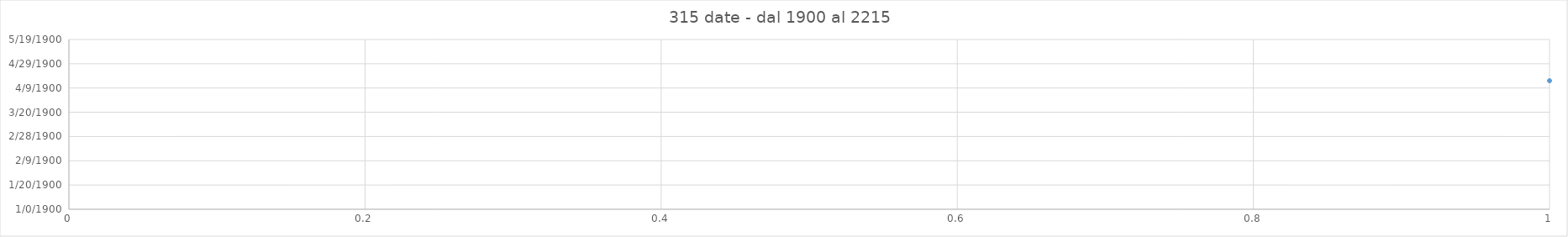
| Category | Series 0 |
|---|---|
| 0 | 4/15/00 |
| 1 | 4/7/00 |
| 2 | 3/30/00 |
| 3 | 4/12/00 |
| 4 | 4/3/00 |
| 5 | 4/23/00 |
| 6 | 4/15/00 |
| 7 | 3/31/00 |
| 8 | 4/19/00 |
| 9 | 4/11/00 |
| 10 | 3/27/00 |
| 11 | 4/16/00 |
| 12 | 4/7/00 |
| 13 | 3/23/00 |
| 14 | 4/12/00 |
| 15 | 4/4/00 |
| 16 | 4/23/00 |
| 17 | 4/8/00 |
| 18 | 3/31/00 |
| 19 | 4/20/00 |
| 20 | 4/4/00 |
| 21 | 3/27/00 |
| 22 | 4/16/00 |
| 23 | 4/1/00 |
| 24 | 4/20/00 |
| 25 | 4/12/00 |
| 26 | 4/4/00 |
| 27 | 4/17/00 |
| 28 | 4/8/00 |
| 29 | 3/31/00 |
| 30 | 4/20/00 |
| 31 | 4/5/00 |
| 32 | 3/27/00 |
| 33 | 4/16/00 |
| 34 | 4/1/00 |
| 35 | 4/21/00 |
| 36 | 4/12/00 |
| 37 | 3/28/00 |
| 38 | 4/17/00 |
| 39 | 4/9/00 |
| 40 | 3/24/00 |
| 41 | 4/13/00 |
| 42 | 4/5/00 |
| 43 | 4/25/00 |
| 44 | 4/9/00 |
| 45 | 4/1/00 |
| 46 | 4/21/00 |
| 47 | 4/6/00 |
| 48 | 3/28/00 |
| 49 | 4/17/00 |
| 50 | 4/9/00 |
| 51 | 3/25/00 |
| 52 | 4/13/00 |
| 53 | 4/5/00 |
| 54 | 4/18/00 |
| 55 | 4/10/00 |
| 56 | 4/1/00 |
| 57 | 4/21/00 |
| 58 | 4/6/00 |
| 59 | 3/29/00 |
| 60 | 4/17/00 |
| 61 | 4/2/00 |
| 62 | 4/22/00 |
| 63 | 4/14/00 |
| 64 | 3/29/00 |
| 65 | 4/18/00 |
| 66 | 4/10/00 |
| 67 | 3/26/00 |
| 68 | 4/14/00 |
| 69 | 4/6/00 |
| 70 | 3/29/00 |
| 71 | 4/11/00 |
| 72 | 4/2/00 |
| 73 | 4/22/00 |
| 74 | 4/14/00 |
| 75 | 3/30/00 |
| 76 | 4/18/00 |
| 77 | 4/10/00 |
| 78 | 3/26/00 |
| 79 | 4/15/00 |
| 80 | 4/6/00 |
| 81 | 4/19/00 |
| 82 | 4/11/00 |
| 83 | 4/3/00 |
| 84 | 4/22/00 |
| 85 | 4/7/00 |
| 86 | 3/30/00 |
| 87 | 4/19/00 |
| 88 | 4/3/00 |
| 89 | 3/26/00 |
| 90 | 4/15/00 |
| 91 | 3/31/00 |
| 92 | 4/19/00 |
| 93 | 4/11/00 |
| 94 | 4/3/00 |
| 95 | 4/16/00 |
| 96 | 4/7/00 |
| 97 | 3/30/00 |
| 98 | 4/12/00 |
| 99 | 4/4/00 |
| 100 | 4/23/00 |
| 101 | 4/15/00 |
| 102 | 3/31/00 |
| 103 | 4/20/00 |
| 104 | 4/11/00 |
| 105 | 3/27/00 |
| 106 | 4/16/00 |
| 107 | 4/8/00 |
| 108 | 3/23/00 |
| 109 | 4/12/00 |
| 110 | 4/4/00 |
| 111 | 4/24/00 |
| 112 | 4/8/00 |
| 113 | 3/31/00 |
| 114 | 4/20/00 |
| 115 | 4/5/00 |
| 116 | 3/27/00 |
| 117 | 4/16/00 |
| 118 | 4/1/00 |
| 119 | 4/21/00 |
| 120 | 4/12/00 |
| 121 | 4/4/00 |
| 122 | 4/17/00 |
| 123 | 4/9/00 |
| 124 | 3/31/00 |
| 125 | 4/20/00 |
| 126 | 4/5/00 |
| 127 | 3/28/00 |
| 128 | 4/16/00 |
| 129 | 4/1/00 |
| 130 | 4/21/00 |
| 131 | 4/13/00 |
| 132 | 3/28/00 |
| 133 | 4/17/00 |
| 134 | 4/9/00 |
| 135 | 3/25/00 |
| 136 | 4/13/00 |
| 137 | 4/5/00 |
| 138 | 4/25/00 |
| 139 | 4/10/00 |
| 140 | 4/1/00 |
| 141 | 4/21/00 |
| 142 | 4/6/00 |
| 143 | 3/29/00 |
| 144 | 4/17/00 |
| 145 | 4/9/00 |
| 146 | 3/25/00 |
| 147 | 4/14/00 |
| 148 | 4/5/00 |
| 149 | 4/18/00 |
| 150 | 4/10/00 |
| 151 | 4/2/00 |
| 152 | 4/21/00 |
| 153 | 4/6/00 |
| 154 | 3/29/00 |
| 155 | 4/18/00 |
| 156 | 4/2/00 |
| 157 | 4/22/00 |
| 158 | 4/14/00 |
| 159 | 3/30/00 |
| 160 | 4/18/00 |
| 161 | 4/10/00 |
| 162 | 3/26/00 |
| 163 | 4/15/00 |
| 164 | 4/6/00 |
| 165 | 3/29/00 |
| 166 | 4/11/00 |
| 167 | 4/3/00 |
| 168 | 4/22/00 |
| 169 | 4/14/00 |
| 170 | 3/30/00 |
| 171 | 4/19/00 |
| 172 | 4/10/00 |
| 173 | 3/26/00 |
| 174 | 4/15/00 |
| 175 | 4/7/00 |
| 176 | 4/19/00 |
| 177 | 4/11/00 |
| 178 | 4/3/00 |
| 179 | 4/23/00 |
| 180 | 4/7/00 |
| 181 | 3/30/00 |
| 182 | 4/19/00 |
| 183 | 4/4/00 |
| 184 | 3/26/00 |
| 185 | 4/15/00 |
| 186 | 3/31/00 |
| 187 | 4/20/00 |
| 188 | 4/11/00 |
| 189 | 4/3/00 |
| 190 | 4/16/00 |
| 191 | 4/8/00 |
| 192 | 3/30/00 |
| 193 | 4/12/00 |
| 194 | 4/4/00 |
| 195 | 4/24/00 |
| 196 | 4/15/00 |
| 197 | 3/31/00 |
| 198 | 4/20/00 |
| 199 | 4/12/00 |
| 200 | 3/28/00 |
| 201 | 4/17/00 |
| 202 | 4/9/00 |
| 203 | 3/25/00 |
| 204 | 4/13/00 |
| 205 | 4/5/00 |
| 206 | 4/18/00 |
| 207 | 4/10/00 |
| 208 | 4/1/00 |
| 209 | 4/21/00 |
| 210 | 4/6/00 |
| 211 | 3/29/00 |
| 212 | 4/17/00 |
| 213 | 4/2/00 |
| 214 | 4/22/00 |
| 215 | 4/14/00 |
| 216 | 3/29/00 |
| 217 | 4/18/00 |
| 218 | 4/10/00 |
| 219 | 3/26/00 |
| 220 | 4/14/00 |
| 221 | 4/6/00 |
| 222 | 3/29/00 |
| 223 | 4/11/00 |
| 224 | 4/2/00 |
| 225 | 4/22/00 |
| 226 | 4/14/00 |
| 227 | 3/30/00 |
| 228 | 4/18/00 |
| 229 | 4/10/00 |
| 230 | 3/26/00 |
| 231 | 4/15/00 |
| 232 | 4/6/00 |
| 233 | 4/19/00 |
| 234 | 4/11/00 |
| 235 | 4/3/00 |
| 236 | 4/22/00 |
| 237 | 4/7/00 |
| 238 | 3/30/00 |
| 239 | 4/19/00 |
| 240 | 4/3/00 |
| 241 | 3/26/00 |
| 242 | 4/15/00 |
| 243 | 3/31/00 |
| 244 | 4/19/00 |
| 245 | 4/11/00 |
| 246 | 4/3/00 |
| 247 | 4/16/00 |
| 248 | 4/7/00 |
| 249 | 3/30/00 |
| 250 | 4/12/00 |
| 251 | 4/4/00 |
| 252 | 4/23/00 |
| 253 | 4/15/00 |
| 254 | 3/31/00 |
| 255 | 4/20/00 |
| 256 | 4/11/00 |
| 257 | 3/27/00 |
| 258 | 4/16/00 |
| 259 | 4/8/00 |
| 260 | 3/23/00 |
| 261 | 4/12/00 |
| 262 | 4/4/00 |
| 263 | 4/24/00 |
| 264 | 4/8/00 |
| 265 | 3/31/00 |
| 266 | 4/20/00 |
| 267 | 4/5/00 |
| 268 | 3/27/00 |
| 269 | 4/16/00 |
| 270 | 4/1/00 |
| 271 | 4/21/00 |
| 272 | 4/12/00 |
| 273 | 4/4/00 |
| 274 | 4/17/00 |
| 275 | 4/9/00 |
| 276 | 3/31/00 |
| 277 | 4/20/00 |
| 278 | 4/5/00 |
| 279 | 3/28/00 |
| 280 | 4/16/00 |
| 281 | 4/1/00 |
| 282 | 4/21/00 |
| 283 | 4/13/00 |
| 284 | 3/28/00 |
| 285 | 4/17/00 |
| 286 | 4/9/00 |
| 287 | 3/25/00 |
| 288 | 4/13/00 |
| 289 | 4/5/00 |
| 290 | 4/25/00 |
| 291 | 4/10/00 |
| 292 | 4/1/00 |
| 293 | 4/21/00 |
| 294 | 4/6/00 |
| 295 | 3/29/00 |
| 296 | 4/17/00 |
| 297 | 4/9/00 |
| 298 | 3/25/00 |
| 299 | 4/14/00 |
| 300 | 4/6/00 |
| 301 | 4/19/00 |
| 302 | 4/11/00 |
| 303 | 4/3/00 |
| 304 | 4/22/00 |
| 305 | 4/7/00 |
| 306 | 3/30/00 |
| 307 | 4/19/00 |
| 308 | 4/3/00 |
| 309 | 3/26/00 |
| 310 | 4/15/00 |
| 311 | 3/31/00 |
| 312 | 4/19/00 |
| 313 | 4/11/00 |
| 314 | 3/27/00 |
| 315 | 4/16/00 |